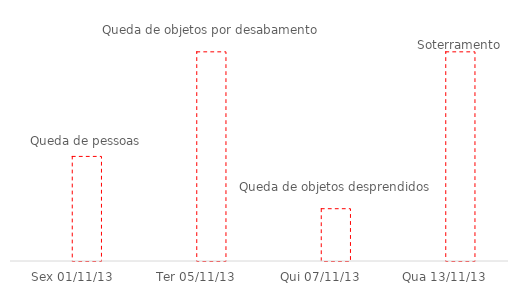
| Category | PROXIMIDADE | VALOR |
|---|---|---|
| Sex 01/11/13 | 0 | 5 |
| Ter 05/11/13 | 0 | 10 |
| Qui 07/11/13 | 0 | 2.5 |
| Qua 13/11/13 | 0 | 10 |